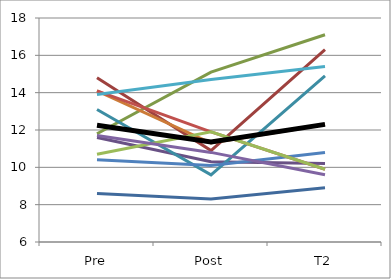
| Category | Series 0 | Series 1 | Series 2 | Series 3 | Series 4 | Series 5 | Series 6 | Series 7 | Series 8 | Series 9 | Series 10 | Mean |
|---|---|---|---|---|---|---|---|---|---|---|---|---|
| Pre | 8.6 | 14.8 | 11.8 | 11.6 | 13.1 | 14.1 | 10.4 | 14.1 | 10.7 | 11.7 | 13.9 | 12.255 |
| Post | 8.3 | 10.9 | 15.1 | 10.3 | 9.6 | 11.3 | 10.1 | 11.9 | 11.9 | 10.8 | 14.7 | 11.355 |
| T2 | 8.9 | 16.3 | 17.1 | 10.2 | 14.9 | 12.3 | 10.8 | 9.9 | 9.9 | 9.6 | 15.4 | 12.3 |